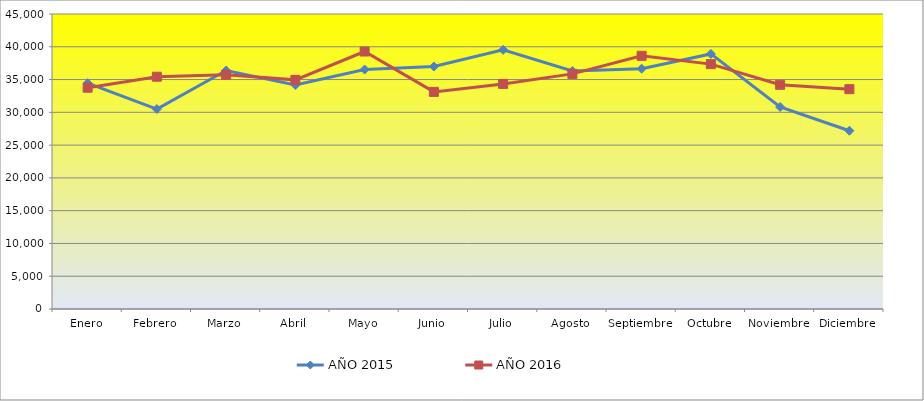
| Category | AÑO 2015 | AÑO 2016 |
|---|---|---|
| Enero | 34452 | 33754 |
| Febrero | 30500 | 35434 |
| Marzo | 36379 | 35726 |
| Abril | 34172 | 34954 |
| Mayo | 36524 | 39274 |
| Junio | 36987 | 33120 |
| Julio | 39530 | 34337 |
| Agosto | 36300 | 35863 |
| Septiembre | 36659 | 38623 |
| Octubre | 38911 | 37354 |
| Noviembre | 30814 | 34200 |
| Diciembre | 27195 | 33531 |